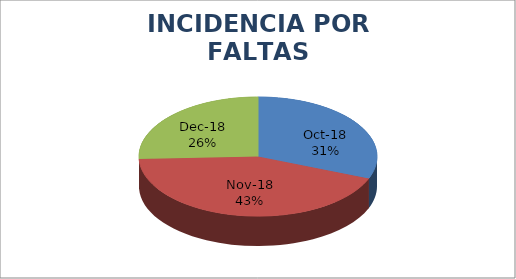
| Category | Series 0 |
|---|---|
| 43374.0 | 35 |
| 43405.0 | 49 |
| 43435.0 | 29 |